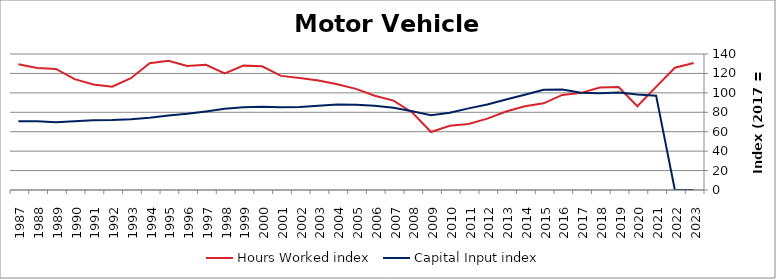
| Category | Hours Worked index | Capital Input index |
|---|---|---|
| 2023.0 | 130.68 | 0 |
| 2022.0 | 125.922 | 0 |
| 2021.0 | 106.184 | 97.136 |
| 2020.0 | 86.226 | 98.327 |
| 2019.0 | 106.086 | 100.269 |
| 2018.0 | 105.469 | 99.632 |
| 2017.0 | 100 | 100 |
| 2016.0 | 97.881 | 103.53 |
| 2015.0 | 89.207 | 103.152 |
| 2014.0 | 86.13 | 97.961 |
| 2013.0 | 80.836 | 93.13 |
| 2012.0 | 73.475 | 88.073 |
| 2011.0 | 68.002 | 84.035 |
| 2010.0 | 66.185 | 79.443 |
| 2009.0 | 59.719 | 77.065 |
| 2008.0 | 79.762 | 81.013 |
| 2007.0 | 92.017 | 84.671 |
| 2006.0 | 97.078 | 86.796 |
| 2005.0 | 104.104 | 87.724 |
| 2004.0 | 108.826 | 87.968 |
| 2003.0 | 112.727 | 86.783 |
| 2002.0 | 115.407 | 85.468 |
| 2001.0 | 117.476 | 85.24 |
| 2000.0 | 127.35 | 85.762 |
| 1999.0 | 128.032 | 85.242 |
| 1998.0 | 120.068 | 83.615 |
| 1997.0 | 128.936 | 80.844 |
| 1996.0 | 127.607 | 78.395 |
| 1995.0 | 132.993 | 76.59 |
| 1994.0 | 130.425 | 74.468 |
| 1993.0 | 115.04 | 72.827 |
| 1992.0 | 106.36 | 72.06 |
| 1991.0 | 108.713 | 71.876 |
| 1990.0 | 114.086 | 70.74 |
| 1989.0 | 124.583 | 69.832 |
| 1988.0 | 125.638 | 70.693 |
| 1987.0 | 129.458 | 70.812 |